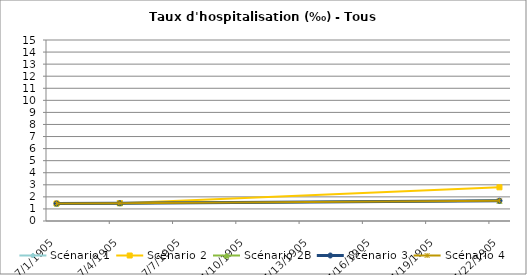
| Category | Scénario 1 | Scénario 2 | Scénario 2B | Scénario 3 | Scénario 4 |
|---|---|---|---|---|---|
| 2009.0 | 1.451 | 1.451 | 1.451 | 1.451 | 1.451 |
| 2012.0 | 1.475 | 1.475 | 1.475 | 1.475 | 1.475 |
| 2030.0 | 1.68 | 2.792 | 1.68 | 1.68 | 1.68 |